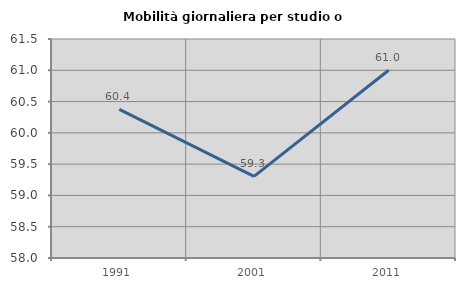
| Category | Mobilità giornaliera per studio o lavoro |
|---|---|
| 1991.0 | 60.374 |
| 2001.0 | 59.305 |
| 2011.0 | 61.001 |